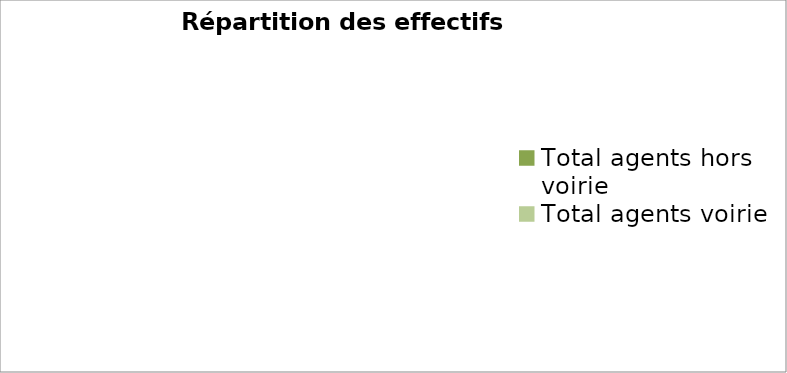
| Category | Series 0 |
|---|---|
| Total agents hors voirie | 0 |
| Total agents voirie | 0 |